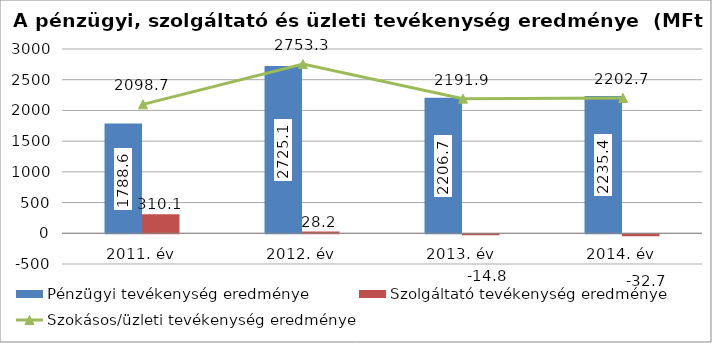
| Category | Pénzügyi tevékenység eredménye | Szolgáltató tevékenység eredménye |
|---|---|---|
| 2011. év | 1788.6 | 310.1 |
| 2012. év | 2725.1 | 28.2 |
| 2013. év | 2206.7 | -14.8 |
| 2014. év | 2235.4 | -32.7 |